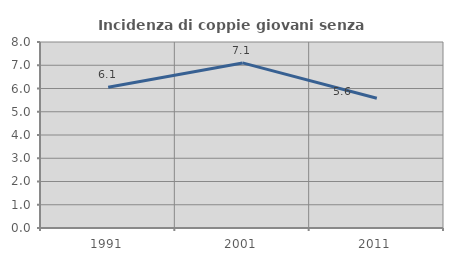
| Category | Incidenza di coppie giovani senza figli |
|---|---|
| 1991.0 | 6.057 |
| 2001.0 | 7.101 |
| 2011.0 | 5.578 |